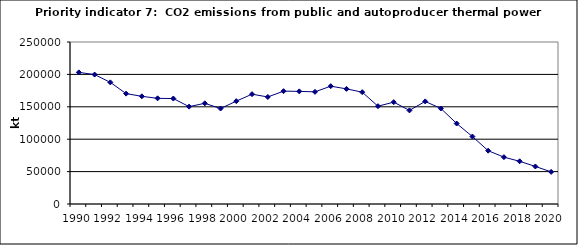
| Category | CO2 emissions from public and autoproducer thermal power stations, kt |
|---|---|
| 1990 | 203113.673 |
| 1991 | 199708.677 |
| 1992 | 187695.656 |
| 1993 | 170351.008 |
| 1994 | 166167.942 |
| 1995 | 163068.529 |
| 1996 | 162745.973 |
| 1997 | 150256.311 |
| 1998 | 155376.504 |
| 1999 | 147339.007 |
| 2000 | 158728.52 |
| 2001 | 169481.562 |
| 2002 | 165157.718 |
| 2003 | 174129.025 |
| 2004 | 173809.141 |
| 2005 | 173062.051 |
| 2006 | 181847.14 |
| 2007 | 177659.55 |
| 2008 | 172595.414 |
| 2009 | 150937.129 |
| 2010 | 157189.523 |
| 2011 | 144444.768 |
| 2012 | 158294.618 |
| 2013 | 147353.04 |
| 2014 | 124195.825 |
| 2015 | 104083.767 |
| 2016 | 82282.004 |
| 2017 | 72299.103 |
| 2018 | 65917.365 |
| 2019 | 57930.451 |
| 2020 | 49578.065 |